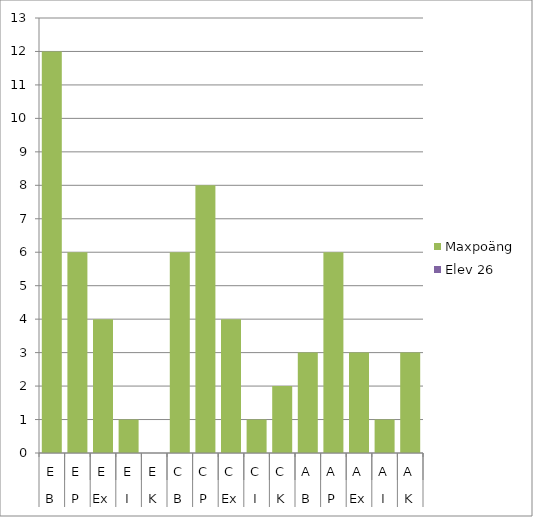
| Category | Maxpoäng | Elev 26 |
|---|---|---|
| 0 | 12 | 0 |
| 1 | 6 | 0 |
| 2 | 4 | 0 |
| 3 | 1 | 0 |
| 4 | 0 | 0 |
| 5 | 6 | 0 |
| 6 | 8 | 0 |
| 7 | 4 | 0 |
| 8 | 1 | 0 |
| 9 | 2 | 0 |
| 10 | 3 | 0 |
| 11 | 6 | 0 |
| 12 | 3 | 0 |
| 13 | 1 | 0 |
| 14 | 3 | 0 |